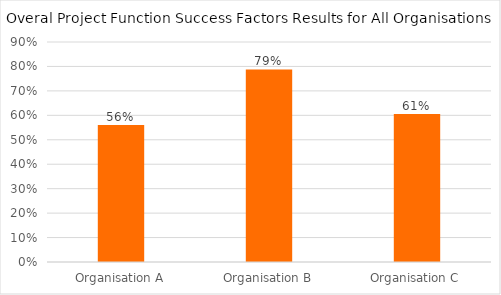
| Category | Overall |
|---|---|
| Organisation A | 0.56 |
| Organisation B | 0.788 |
| Organisation C | 0.605 |